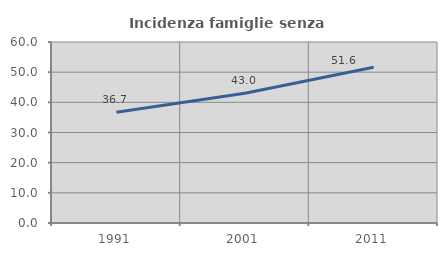
| Category | Incidenza famiglie senza nuclei |
|---|---|
| 1991.0 | 36.688 |
| 2001.0 | 43.006 |
| 2011.0 | 51.6 |